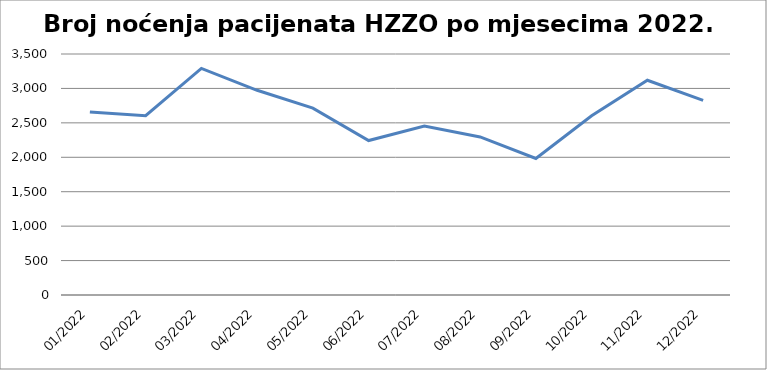
| Category | Series 0 |
|---|---|
| 01/2022 | 2658 |
| 02/2022 | 2603 |
| 03/2022 | 3290 |
| 04/2022 | 2973 |
| 05/2022 | 2714 |
| 06/2022 | 2243 |
| 07/2022 | 2454 |
| 08/2022 | 2296 |
| 09/2022 | 1983 |
| 10/2022 | 2602 |
| 11/2022 | 3119 |
| 12/2022 | 2827 |